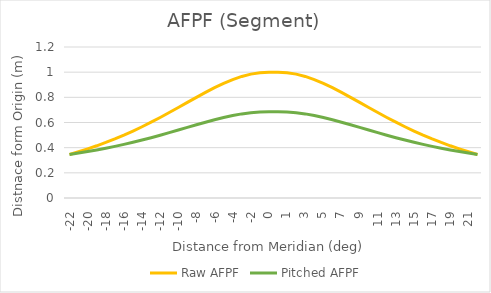
| Category | Raw AFPF | Pitched AFPF |
|---|---|---|
| -22.0 | 0.346 | 0.346 |
| -21.0 | 0.367 | 0.357 |
| -20.0 | 0.39 | 0.369 |
| -19.0 | 0.415 | 0.382 |
| -18.0 | 0.441 | 0.396 |
| -17.0 | 0.47 | 0.41 |
| -16.0 | 0.5 | 0.426 |
| -15.0 | 0.532 | 0.443 |
| -14.0 | 0.566 | 0.461 |
| -13.0 | 0.602 | 0.479 |
| -12.0 | 0.64 | 0.499 |
| -11.0 | 0.679 | 0.519 |
| -10.0 | 0.719 | 0.54 |
| -9.0 | 0.76 | 0.561 |
| -8.0 | 0.8 | 0.582 |
| -7.0 | 0.839 | 0.603 |
| -6.0 | 0.877 | 0.622 |
| -5.0 | 0.911 | 0.64 |
| -4.0 | 0.941 | 0.655 |
| -3.0 | 0.966 | 0.668 |
| -2.0 | 0.985 | 0.678 |
| -1.0 | 0.996 | 0.684 |
| 0.0 | 1 | 0.686 |
| 0.0 | 1 | 0.686 |
| 1.0 | 0.996 | 0.684 |
| 2.0 | 0.985 | 0.678 |
| 3.0 | 0.966 | 0.668 |
| 4.0 | 0.941 | 0.655 |
| 5.0 | 0.911 | 0.64 |
| 6.0 | 0.877 | 0.622 |
| 7.0 | 0.839 | 0.603 |
| 8.0 | 0.8 | 0.582 |
| 9.0 | 0.76 | 0.561 |
| 10.0 | 0.719 | 0.54 |
| 11.0 | 0.679 | 0.519 |
| 12.0 | 0.64 | 0.499 |
| 13.0 | 0.602 | 0.479 |
| 14.0 | 0.566 | 0.461 |
| 15.0 | 0.532 | 0.443 |
| 16.0 | 0.5 | 0.426 |
| 17.0 | 0.47 | 0.41 |
| 18.0 | 0.441 | 0.396 |
| 19.0 | 0.415 | 0.382 |
| 20.0 | 0.39 | 0.369 |
| 21.0 | 0.367 | 0.357 |
| 22.0 | 0.346 | 0.346 |